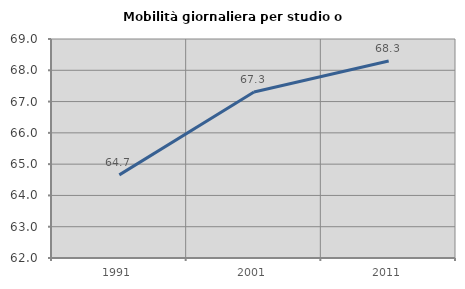
| Category | Mobilità giornaliera per studio o lavoro |
|---|---|
| 1991.0 | 64.658 |
| 2001.0 | 67.308 |
| 2011.0 | 68.299 |